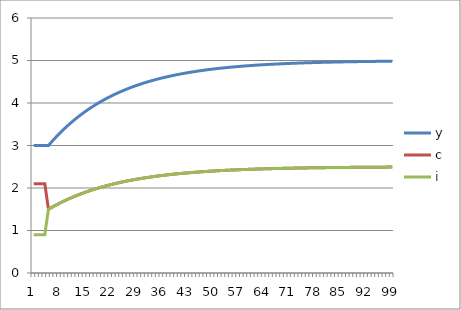
| Category | y | c | i |
|---|---|---|---|
| 0 | 3 | 2.1 | 0.9 |
| 1 | 3 | 2.1 | 0.9 |
| 2 | 3 | 2.1 | 0.9 |
| 3 | 3 | 2.1 | 0.9 |
| 4 | 3 | 1.5 | 1.5 |
| 5 | 3.098 | 1.549 | 1.549 |
| 6 | 3.192 | 1.596 | 1.596 |
| 7 | 3.281 | 1.641 | 1.641 |
| 8 | 3.366 | 1.683 | 1.683 |
| 9 | 3.447 | 1.723 | 1.723 |
| 10 | 3.524 | 1.762 | 1.762 |
| 11 | 3.597 | 1.798 | 1.798 |
| 12 | 3.666 | 1.833 | 1.833 |
| 13 | 3.732 | 1.866 | 1.866 |
| 14 | 3.795 | 1.898 | 1.898 |
| 15 | 3.855 | 1.927 | 1.927 |
| 16 | 3.912 | 1.956 | 1.956 |
| 17 | 3.966 | 1.983 | 1.983 |
| 18 | 4.017 | 2.009 | 2.009 |
| 19 | 4.066 | 2.033 | 2.033 |
| 20 | 4.112 | 2.056 | 2.056 |
| 21 | 4.157 | 2.078 | 2.078 |
| 22 | 4.199 | 2.099 | 2.099 |
| 23 | 4.238 | 2.119 | 2.119 |
| 24 | 4.276 | 2.138 | 2.138 |
| 25 | 4.312 | 2.156 | 2.156 |
| 26 | 4.347 | 2.173 | 2.173 |
| 27 | 4.379 | 2.19 | 2.19 |
| 28 | 4.41 | 2.205 | 2.205 |
| 29 | 4.439 | 2.22 | 2.22 |
| 30 | 4.467 | 2.234 | 2.234 |
| 31 | 4.494 | 2.247 | 2.247 |
| 32 | 4.519 | 2.26 | 2.26 |
| 33 | 4.543 | 2.272 | 2.272 |
| 34 | 4.566 | 2.283 | 2.283 |
| 35 | 4.588 | 2.294 | 2.294 |
| 36 | 4.608 | 2.304 | 2.304 |
| 37 | 4.628 | 2.314 | 2.314 |
| 38 | 4.646 | 2.323 | 2.323 |
| 39 | 4.664 | 2.332 | 2.332 |
| 40 | 4.681 | 2.34 | 2.34 |
| 41 | 4.697 | 2.348 | 2.348 |
| 42 | 4.712 | 2.356 | 2.356 |
| 43 | 4.726 | 2.363 | 2.363 |
| 44 | 4.74 | 2.37 | 2.37 |
| 45 | 4.753 | 2.376 | 2.376 |
| 46 | 4.765 | 2.383 | 2.383 |
| 47 | 4.777 | 2.388 | 2.388 |
| 48 | 4.788 | 2.394 | 2.394 |
| 49 | 4.799 | 2.399 | 2.399 |
| 50 | 4.809 | 2.404 | 2.404 |
| 51 | 4.818 | 2.409 | 2.409 |
| 52 | 4.827 | 2.414 | 2.414 |
| 53 | 4.836 | 2.418 | 2.418 |
| 54 | 4.844 | 2.422 | 2.422 |
| 55 | 4.852 | 2.426 | 2.426 |
| 56 | 4.859 | 2.43 | 2.43 |
| 57 | 4.866 | 2.433 | 2.433 |
| 58 | 4.873 | 2.437 | 2.437 |
| 59 | 4.879 | 2.44 | 2.44 |
| 60 | 4.885 | 2.443 | 2.443 |
| 61 | 4.891 | 2.446 | 2.446 |
| 62 | 4.897 | 2.448 | 2.448 |
| 63 | 4.902 | 2.451 | 2.451 |
| 64 | 4.907 | 2.453 | 2.453 |
| 65 | 4.911 | 2.456 | 2.456 |
| 66 | 4.916 | 2.458 | 2.458 |
| 67 | 4.92 | 2.46 | 2.46 |
| 68 | 4.924 | 2.462 | 2.462 |
| 69 | 4.928 | 2.464 | 2.464 |
| 70 | 4.931 | 2.466 | 2.466 |
| 71 | 4.935 | 2.467 | 2.467 |
| 72 | 4.938 | 2.469 | 2.469 |
| 73 | 4.941 | 2.471 | 2.471 |
| 74 | 4.944 | 2.472 | 2.472 |
| 75 | 4.947 | 2.473 | 2.473 |
| 76 | 4.95 | 2.475 | 2.475 |
| 77 | 4.952 | 2.476 | 2.476 |
| 78 | 4.954 | 2.477 | 2.477 |
| 79 | 4.957 | 2.478 | 2.478 |
| 80 | 4.959 | 2.479 | 2.479 |
| 81 | 4.961 | 2.48 | 2.48 |
| 82 | 4.963 | 2.481 | 2.481 |
| 83 | 4.965 | 2.482 | 2.482 |
| 84 | 4.967 | 2.483 | 2.483 |
| 85 | 4.968 | 2.484 | 2.484 |
| 86 | 4.97 | 2.485 | 2.485 |
| 87 | 4.971 | 2.486 | 2.486 |
| 88 | 4.973 | 2.486 | 2.486 |
| 89 | 4.974 | 2.487 | 2.487 |
| 90 | 4.975 | 2.488 | 2.488 |
| 91 | 4.977 | 2.488 | 2.488 |
| 92 | 4.978 | 2.489 | 2.489 |
| 93 | 4.979 | 2.489 | 2.489 |
| 94 | 4.98 | 2.49 | 2.49 |
| 95 | 4.981 | 2.49 | 2.49 |
| 96 | 4.982 | 2.491 | 2.491 |
| 97 | 4.983 | 2.491 | 2.491 |
| 98 | 4.984 | 2.492 | 2.492 |